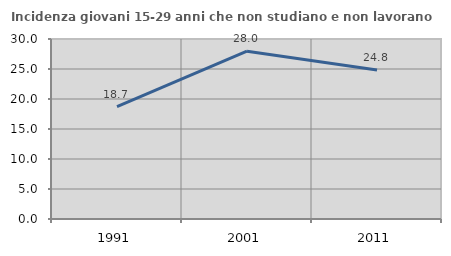
| Category | Incidenza giovani 15-29 anni che non studiano e non lavorano  |
|---|---|
| 1991.0 | 18.721 |
| 2001.0 | 27.96 |
| 2011.0 | 24.822 |